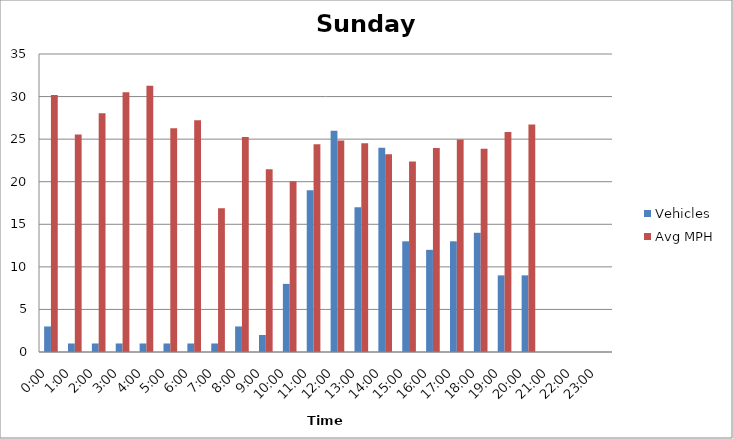
| Category | Vehicles | Avg MPH |
|---|---|---|
| 0:00 | 3 | 30.18 |
| 1:00 | 1 | 25.55 |
| 2:00 | 1 | 28.04 |
| 3:00 | 1 | 30.52 |
| 4:00 | 1 | 31.26 |
| 5:00 | 1 | 26.28 |
| 6:00 | 1 | 27.23 |
| 7:00 | 1 | 16.87 |
| 8:00 | 3 | 25.26 |
| 9:00 | 2 | 21.46 |
| 10:00 | 8 | 20.06 |
| 11:00 | 19 | 24.41 |
| 12:00 | 26 | 24.85 |
| 13:00 | 17 | 24.53 |
| 14:00 | 24 | 23.23 |
| 15:00 | 13 | 22.37 |
| 16:00 | 12 | 23.96 |
| 17:00 | 13 | 24.96 |
| 18:00 | 14 | 23.86 |
| 19:00 | 9 | 25.85 |
| 20:00 | 9 | 26.71 |
| 21:00 | 0 | 0 |
| 22:00 | 0 | 0 |
| 23:00 | 0 | 0 |